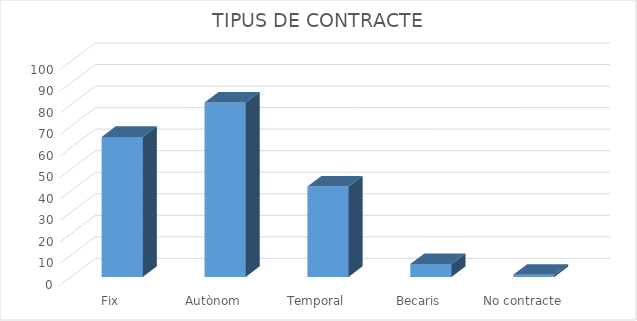
| Category | Series 0 |
|---|---|
| Fix | 65 |
| Autònom | 81 |
| Temporal | 42 |
| Becaris | 6 |
| No contracte | 1 |